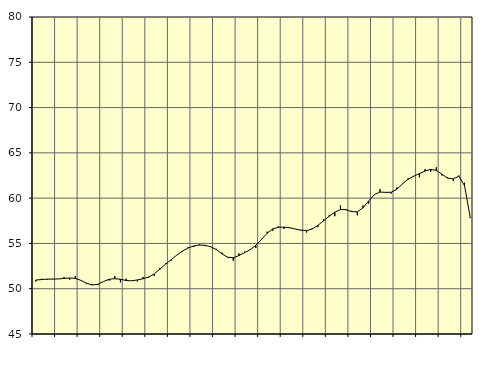
| Category | Piggar | Samtliga anställda (inkl. anställda utomlands) |
|---|---|---|
| nan | 50.8 | 50.96 |
| 1.0 | 51.1 | 51.01 |
| 1.0 | 51 | 51.06 |
| 1.0 | 51.1 | 51.06 |
| nan | 51.1 | 51.08 |
| 2.0 | 51.3 | 51.13 |
| 2.0 | 51 | 51.18 |
| 2.0 | 51.4 | 51.14 |
| nan | 50.9 | 50.92 |
| 3.0 | 50.5 | 50.61 |
| 3.0 | 50.5 | 50.41 |
| 3.0 | 50.4 | 50.49 |
| nan | 50.8 | 50.79 |
| 4.0 | 50.9 | 51.04 |
| 4.0 | 51.4 | 51.11 |
| 4.0 | 50.7 | 51.04 |
| nan | 51.1 | 50.91 |
| 5.0 | 50.9 | 50.87 |
| 5.0 | 50.8 | 50.97 |
| 5.0 | 51.3 | 51.1 |
| nan | 51.2 | 51.29 |
| 6.0 | 51.4 | 51.64 |
| 6.0 | 52.3 | 52.16 |
| 6.0 | 52.8 | 52.71 |
| nan | 53.1 | 53.21 |
| 7.0 | 53.7 | 53.72 |
| 7.0 | 54.1 | 54.16 |
| 7.0 | 54.6 | 54.5 |
| nan | 54.6 | 54.72 |
| 8.0 | 54.9 | 54.82 |
| 8.0 | 54.7 | 54.79 |
| 8.0 | 54.6 | 54.63 |
| nan | 54.4 | 54.32 |
| 9.0 | 54 | 53.85 |
| 9.0 | 53.4 | 53.48 |
| 9.0 | 53.1 | 53.42 |
| nan | 53.9 | 53.66 |
| 10.0 | 54.1 | 53.98 |
| 10.0 | 54.3 | 54.32 |
| 10.0 | 54.5 | 54.79 |
| nan | 55.5 | 55.43 |
| 11.0 | 56.3 | 56.12 |
| 11.0 | 56.4 | 56.6 |
| 11.0 | 56.9 | 56.79 |
| nan | 56.6 | 56.8 |
| 12.0 | 56.8 | 56.73 |
| 12.0 | 56.6 | 56.59 |
| 12.0 | 56.5 | 56.46 |
| nan | 56.2 | 56.41 |
| 13.0 | 56.7 | 56.59 |
| 13.0 | 56.8 | 57 |
| 13.0 | 57.7 | 57.49 |
| nan | 58.1 | 58 |
| 14.0 | 58 | 58.45 |
| 14.0 | 59.2 | 58.74 |
| 14.0 | 58.8 | 58.72 |
| nan | 58.6 | 58.51 |
| 15.0 | 58.1 | 58.49 |
| 15.0 | 59.2 | 58.93 |
| 15.0 | 59.4 | 59.68 |
| nan | 60.4 | 60.38 |
| 16.0 | 61 | 60.67 |
| 16.0 | 60.6 | 60.64 |
| 16.0 | 60.5 | 60.65 |
| nan | 61.2 | 60.98 |
| 17.0 | 61.6 | 61.58 |
| 17.0 | 62.2 | 62.09 |
| 17.0 | 62.4 | 62.43 |
| nan | 62.3 | 62.71 |
| 18.0 | 63.2 | 62.99 |
| 18.0 | 62.9 | 63.18 |
| 18.0 | 63.4 | 63.06 |
| nan | 62.5 | 62.64 |
| 19.0 | 62.3 | 62.21 |
| 19.0 | 61.9 | 62.12 |
| 19.0 | 62.5 | 62.43 |
| nan | 61.7 | 61.38 |
| 20.0 | 57.8 | 57.89 |